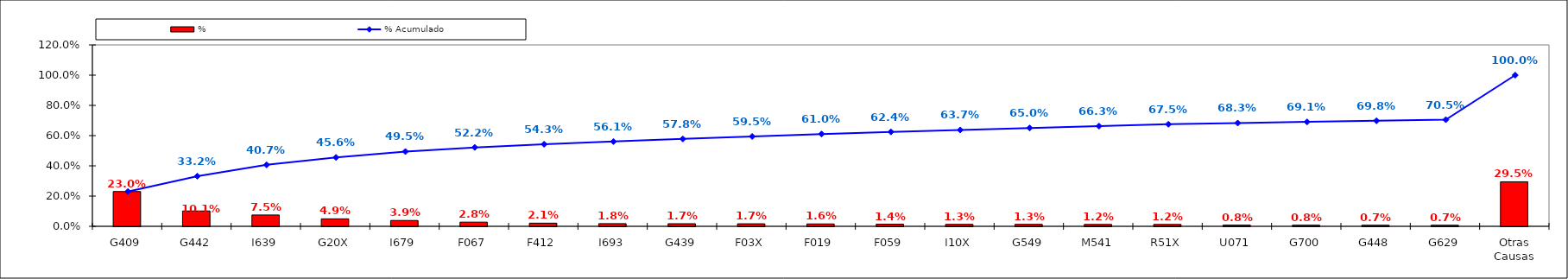
| Category | % |
|---|---|
| G409 | 0.23 |
| G442 | 0.101 |
| I639 | 0.075 |
| G20X | 0.049 |
| I679 | 0.039 |
| F067 | 0.028 |
| F412 | 0.021 |
| I693 | 0.018 |
| G439 | 0.017 |
| F03X | 0.017 |
| F019 | 0.016 |
| F059 | 0.014 |
| I10X | 0.013 |
| G549 | 0.013 |
| M541 | 0.012 |
| R51X | 0.012 |
| U071 | 0.008 |
| G700 | 0.008 |
| G448 | 0.007 |
| G629 | 0.007 |
| Otras Causas | 0.295 |